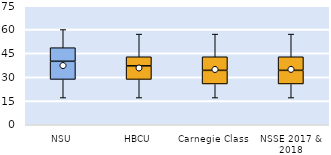
| Category | 25th | 50th | 75th |
|---|---|---|---|
| NSU | 28.571 | 11.429 | 8.571 |
| HBCU | 28.571 | 8.571 | 5.714 |
| Carnegie Class | 25.714 | 8.571 | 8.571 |
| NSSE 2017 & 2018 | 25.714 | 8.571 | 8.571 |